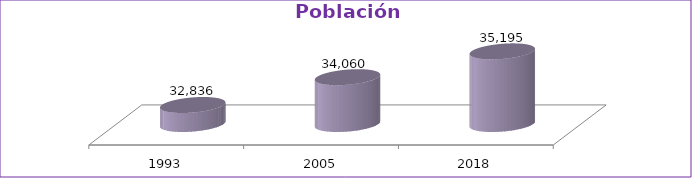
| Category | Población Total |
|---|---|
| 1993 | 32836 |
| 2005 | 34060 |
| 2018 | 35195 |